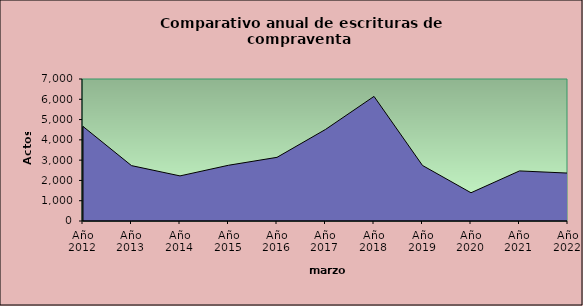
| Category | Cantidad de Actos |
|---|---|
| Año 2012 | 4661 |
| Año 2013 | 2730 |
| Año 2014 | 2223 |
| Año 2015 | 2748 |
| Año 2016 | 3138 |
| Año 2017 | 4513 |
| Año 2018 | 6142 |
| Año 2019 | 2738 |
| Año 2020 | 1393 |
| Año 2021 | 2469 |
| Año 2022 | 2361 |